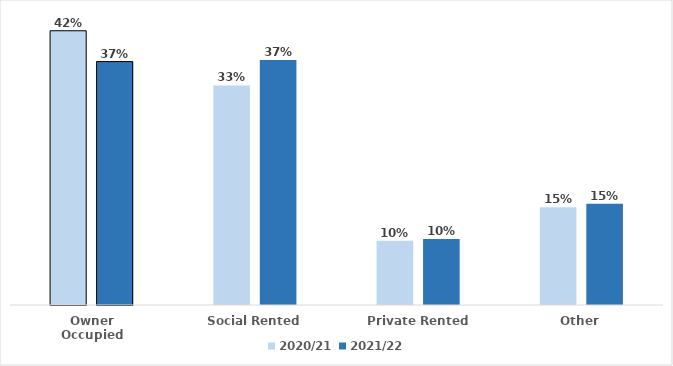
| Category | 2020/21 | 2021/22 |
|---|---|---|
| Owner Occupied | 0.418 | 0.371 |
| Social Rented | 0.335 | 0.374 |
| Private Rented | 0.098 | 0.101 |
| Other | 0.149 | 0.154 |